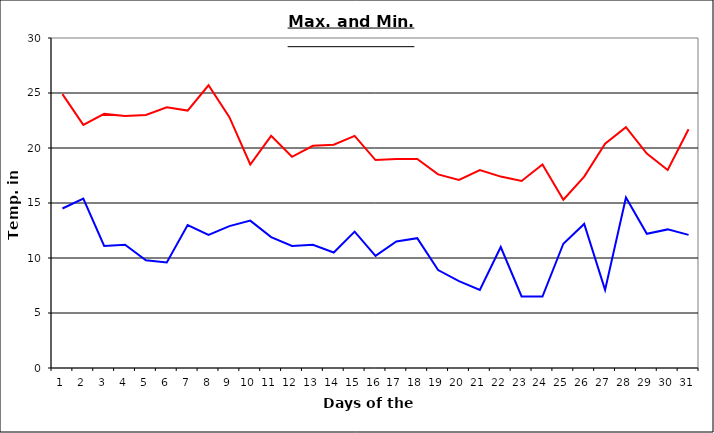
| Category | Series 0 | Series 1 |
|---|---|---|
| 0 | 24.9 | 14.5 |
| 1 | 22.1 | 15.4 |
| 2 | 23.1 | 11.1 |
| 3 | 22.9 | 11.2 |
| 4 | 23 | 9.8 |
| 5 | 23.7 | 9.6 |
| 6 | 23.4 | 13 |
| 7 | 25.7 | 12.1 |
| 8 | 22.8 | 12.9 |
| 9 | 18.5 | 13.4 |
| 10 | 21.1 | 11.9 |
| 11 | 19.2 | 11.1 |
| 12 | 20.2 | 11.2 |
| 13 | 20.3 | 10.5 |
| 14 | 21.1 | 12.4 |
| 15 | 18.9 | 10.2 |
| 16 | 19 | 11.5 |
| 17 | 19 | 11.8 |
| 18 | 17.6 | 8.9 |
| 19 | 17.1 | 7.9 |
| 20 | 18 | 7.1 |
| 21 | 17.4 | 11 |
| 22 | 17 | 6.5 |
| 23 | 18.5 | 6.5 |
| 24 | 15.3 | 11.3 |
| 25 | 17.4 | 13.1 |
| 26 | 20.4 | 7.1 |
| 27 | 21.9 | 15.5 |
| 28 | 19.5 | 12.2 |
| 29 | 18 | 12.6 |
| 30 | 21.7 | 12.1 |